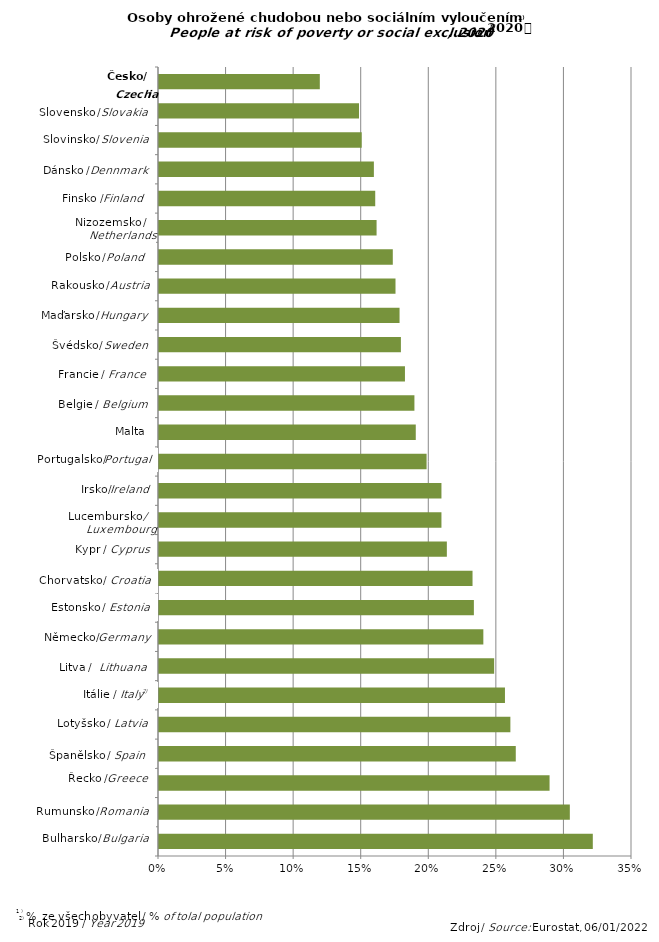
| Category | Series 0 |
|---|---|
| Bulgaria | 0.321 |
| Romania | 0.304 |
| Greece | 0.289 |
| Spain | 0.264 |
| Latvia | 0.26 |
| Italy | 0.256 |
| Lithuania | 0.248 |
| Germany | 0.24 |
| Estonia | 0.233 |
| Croatia | 0.232 |
| Cyprus | 0.213 |
| Luxembourg | 0.209 |
| Ireland | 0.209 |
| Portugal | 0.198 |
| Malta | 0.19 |
| Belgium | 0.189 |
| France | 0.182 |
| Sweden | 0.179 |
| Hungary | 0.178 |
| Austria | 0.175 |
| Poland | 0.173 |
| Netherlands | 0.161 |
| Finland | 0.16 |
| Denmark | 0.159 |
| Slovenia | 0.15 |
| Slovakia | 0.148 |
| Czechia | 0.119 |